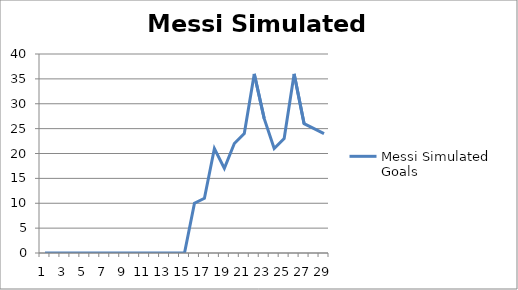
| Category | Messi Simulated Goals |
|---|---|
| 0 | 0 |
| 1 | 0 |
| 2 | 0 |
| 3 | 0 |
| 4 | 0 |
| 5 | 0 |
| 6 | 0 |
| 7 | 0 |
| 8 | 0 |
| 9 | 0 |
| 10 | 0 |
| 11 | 0 |
| 12 | 0 |
| 13 | 0 |
| 14 | 0 |
| 15 | 10 |
| 16 | 11 |
| 17 | 21 |
| 18 | 17 |
| 19 | 22 |
| 20 | 24 |
| 21 | 36 |
| 22 | 27 |
| 23 | 21 |
| 24 | 23 |
| 25 | 36 |
| 26 | 26 |
| 27 | 25 |
| 28 | 24 |